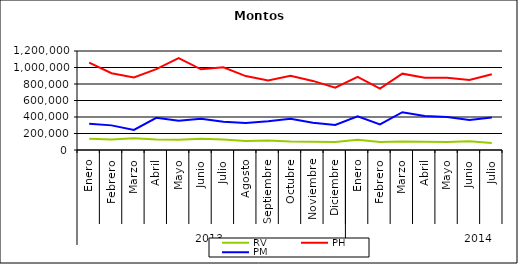
| Category | RV | PH | PM |
|---|---|---|---|
| 0 | 136808.804 | 1058774.967 | 316751.291 |
| 1 | 127193.421 | 930111.334 | 298480.292 |
| 2 | 142052.509 | 880100.908 | 242691.68 |
| 3 | 126637.277 | 980038.371 | 389833.89 |
| 4 | 123189.846 | 1112542.201 | 355777.139 |
| 5 | 135184.022 | 977877.296 | 379782.022 |
| 6 | 127790.361 | 1003315.643 | 342842.568 |
| 7 | 110532.346 | 895717.973 | 326616.455 |
| 8 | 114630.859 | 843607.598 | 348985.725 |
| 9 | 102262.08 | 901170.281 | 379642.157 |
| 10 | 99242.352 | 837424.505 | 330278.777 |
| 11 | 96243.301 | 754952.55 | 304473.582 |
| 12 | 124770.971 | 885857.327 | 408057.686 |
| 13 | 96987.292 | 744736.746 | 309218.036 |
| 14 | 103624.997 | 925209.281 | 458118.752 |
| 15 | 100007.683 | 874534.649 | 410841.727 |
| 16 | 96199.147 | 875356.86 | 399197.561 |
| 17 | 104965.63 | 848001.408 | 363776.247 |
| 18 | 85979.134 | 918529.646 | 394798.235 |